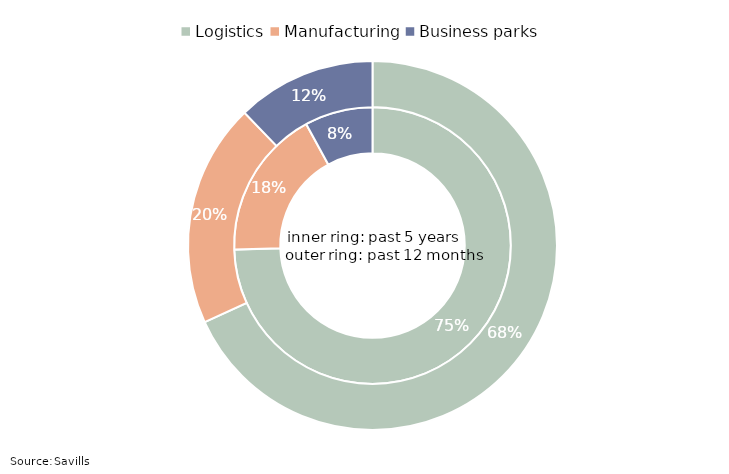
| Category | Series 1 | Series 0 |
|---|---|---|
| Logistics | 0.745 | 0.682 |
| Manufacturing | 0.175 | 0.196 |
| Business parks | 0.08 | 0.122 |